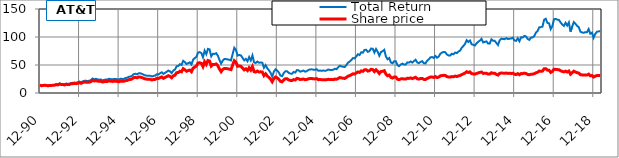
| Category | Total Return | Share price |
|---|---|---|
| 1990-12-31 | 14 | 14 |
| 1991-01-31 | 13.229 | 13.062 |
| 1991-02-28 | 13.609 | 13.438 |
| 1991-03-29 | 14.211 | 14.031 |
| 1991-04-30 | 13.689 | 13.344 |
| 1991-05-31 | 13.273 | 12.938 |
| 1991-06-28 | 13.722 | 13.375 |
| 1991-07-31 | 14.035 | 13.5 |
| 1991-08-30 | 14.295 | 13.75 |
| 1991-09-30 | 14.523 | 13.969 |
| 1991-10-31 | 15.828 | 15.031 |
| 1991-11-29 | 15.203 | 14.438 |
| 1991-12-31 | 17.013 | 16.156 |
| 1992-01-31 | 16.069 | 15.094 |
| 1992-02-28 | 16.069 | 15.094 |
| 1992-03-31 | 15.303 | 14.375 |
| 1992-04-30 | 16.809 | 15.594 |
| 1992-05-29 | 16.236 | 15.062 |
| 1992-06-30 | 16.438 | 15.25 |
| 1992-07-31 | 17.955 | 16.469 |
| 1992-08-31 | 18.126 | 16.625 |
| 1992-09-30 | 18.671 | 17.125 |
| 1992-10-30 | 18.393 | 16.688 |
| 1992-11-30 | 19.116 | 17.344 |
| 1992-12-31 | 20.39 | 18.5 |
| 1993-01-29 | 19.168 | 17.219 |
| 1993-02-26 | 20.734 | 18.625 |
| 1993-03-31 | 21.743 | 19.531 |
| 1993-04-30 | 21.712 | 19.312 |
| 1993-05-31 | 21.571 | 19.188 |
| 1993-06-30 | 21.782 | 19.375 |
| 1993-07-30 | 22.987 | 20.25 |
| 1993-08-31 | 25.824 | 22.75 |
| 1993-09-30 | 24.405 | 21.5 |
| 1993-10-29 | 25.335 | 22.125 |
| 1993-11-30 | 24.333 | 21.25 |
| 1993-12-31 | 23.76 | 20.75 |
| 1994-01-31 | 24.198 | 20.938 |
| 1994-02-28 | 22.609 | 19.562 |
| 1994-03-31 | 23.331 | 20.188 |
| 1994-04-29 | 24.226 | 20.75 |
| 1994-05-31 | 24.007 | 20.562 |
| 1994-06-30 | 25.394 | 21.75 |
| 1994-07-29 | 24.743 | 21 |
| 1994-08-31 | 24.375 | 20.688 |
| 1994-09-30 | 25.038 | 21.25 |
| 1994-10-31 | 24.913 | 20.938 |
| 1994-11-30 | 24.616 | 20.688 |
| 1994-12-30 | 24.021 | 20.188 |
| 1995-01-31 | 25.61 | 21.312 |
| 1995-02-28 | 25.009 | 20.812 |
| 1995-03-31 | 25.235 | 21 |
| 1995-04-28 | 26.77 | 22.062 |
| 1995-05-31 | 27.301 | 22.5 |
| 1995-06-30 | 28.894 | 23.812 |
| 1995-07-31 | 29.453 | 24.062 |
| 1995-08-31 | 30.982 | 25.312 |
| 1995-09-29 | 33.66 | 27.5 |
| 1995-10-31 | 34.455 | 27.938 |
| 1995-11-30 | 33.376 | 27.062 |
| 1995-12-29 | 35.303 | 28.625 |
| 1996-01-31 | 35.166 | 28.312 |
| 1996-02-29 | 34.079 | 27.438 |
| 1996-03-29 | 32.682 | 26.312 |
| 1996-04-30 | 31.409 | 25.062 |
| 1996-05-31 | 30.939 | 24.688 |
| 1996-06-28 | 30.861 | 24.625 |
| 1996-07-31 | 30.902 | 24.438 |
| 1996-08-30 | 29.479 | 23.312 |
| 1996-09-30 | 30.428 | 24.062 |
| 1996-10-31 | 31.015 | 24.312 |
| 1996-11-29 | 33.566 | 26.312 |
| 1996-12-31 | 33.088 | 25.938 |
| 1997-01-31 | 35.377 | 27.5 |
| 1997-02-28 | 36.985 | 28.75 |
| 1997-03-31 | 34.045 | 26.25 |
| 1997-04-30 | 35.991 | 27.75 |
| 1997-05-30 | 37.936 | 29.25 |
| 1997-06-30 | 40.125 | 30.938 |
| 1997-07-31 | 38.66 | 29.594 |
| 1997-08-29 | 35.517 | 27.188 |
| 1997-09-30 | 40.13 | 30.719 |
| 1997-10-31 | 41.853 | 31.812 |
| 1997-11-28 | 47.773 | 36.312 |
| 1997-12-31 | 48.184 | 36.625 |
| 1998-01-30 | 51.458 | 38.875 |
| 1998-02-27 | 50.052 | 37.812 |
| 1998-03-31 | 57.415 | 43.375 |
| 1998-04-30 | 55.148 | 41.438 |
| 1998-05-29 | 51.738 | 38.875 |
| 1998-06-30 | 53.235 | 40 |
| 1998-07-31 | 54.805 | 40.938 |
| 1998-08-31 | 50.956 | 38.062 |
| 1998-09-30 | 59.407 | 44.375 |
| 1998-10-30 | 62.303 | 46.312 |
| 1998-11-30 | 64.489 | 47.938 |
| 1998-12-31 | 72.141 | 53.625 |
| 1999-01-29 | 72.959 | 54 |
| 1999-02-26 | 71.439 | 52.875 |
| 1999-03-31 | 63.755 | 47.188 |
| 1999-04-30 | 75.676 | 55.75 |
| 1999-05-31 | 69.398 | 51.125 |
| 1999-06-30 | 78.73 | 58 |
| 1999-07-30 | 77.875 | 57.125 |
| 1999-08-31 | 65.521 | 48.062 |
| 1999-09-30 | 69.963 | 51.062 |
| 1999-10-29 | 69.706 | 50.875 |
| 1999-11-30 | 71.076 | 51.875 |
| 1999-12-31 | 66.794 | 48.75 |
| 2000-01-31 | 59.072 | 42.875 |
| 2000-02-29 | 52.441 | 38.062 |
| 2000-03-31 | 58.038 | 42.125 |
| 2000-04-28 | 60.687 | 43.812 |
| 2000-05-31 | 60.515 | 43.688 |
| 2000-06-30 | 59.908 | 43.25 |
| 2000-07-31 | 59.3 | 42.562 |
| 2000-08-31 | 58.168 | 41.75 |
| 2000-09-29 | 69.662 | 50 |
| 2000-10-31 | 80.754 | 57.688 |
| 2000-11-30 | 76.904 | 54.938 |
| 2000-12-29 | 66.843 | 47.75 |
| 2001-01-31 | 68.025 | 48.35 |
| 2001-02-28 | 67.111 | 47.7 |
| 2001-03-30 | 62.791 | 44.63 |
| 2001-04-30 | 58.38 | 41.25 |
| 2001-05-31 | 60.927 | 43.05 |
| 2001-06-29 | 56.695 | 40.06 |
| 2001-07-31 | 64.138 | 45.03 |
| 2001-08-31 | 58.269 | 40.91 |
| 2001-09-28 | 67.114 | 47.12 |
| 2001-10-31 | 54.591 | 38.11 |
| 2001-11-30 | 53.545 | 37.38 |
| 2001-12-31 | 56.109 | 39.17 |
| 2002-01-31 | 53.991 | 37.45 |
| 2002-02-28 | 54.554 | 37.84 |
| 2002-03-29 | 53.977 | 37.44 |
| 2002-04-30 | 45.11 | 31.06 |
| 2002-05-31 | 49.801 | 34.29 |
| 2002-06-28 | 44.297 | 30.5 |
| 2002-07-31 | 40.515 | 27.66 |
| 2002-08-30 | 36.238 | 24.74 |
| 2002-09-30 | 29.441 | 20.1 |
| 2002-10-31 | 38.081 | 25.66 |
| 2002-11-29 | 42.296 | 28.5 |
| 2002-12-31 | 40.233 | 27.11 |
| 2003-01-31 | 36.611 | 24.44 |
| 2003-02-28 | 31.158 | 20.8 |
| 2003-03-31 | 30.05 | 20.06 |
| 2003-04-30 | 35.535 | 23.36 |
| 2003-05-30 | 38.729 | 25.46 |
| 2003-06-30 | 38.866 | 25.55 |
| 2003-07-31 | 36.055 | 23.36 |
| 2003-08-29 | 34.666 | 22.46 |
| 2003-09-30 | 34.342 | 22.25 |
| 2003-10-31 | 37.651 | 23.98 |
| 2003-11-28 | 36.552 | 23.28 |
| 2003-12-31 | 40.933 | 26.07 |
| 2004-01-30 | 40.499 | 25.5 |
| 2004-02-27 | 38.133 | 24.01 |
| 2004-03-31 | 38.975 | 24.54 |
| 2004-04-30 | 40.04 | 24.9 |
| 2004-05-31 | 38.11 | 23.7 |
| 2004-06-30 | 38.995 | 24.25 |
| 2004-07-30 | 41.281 | 25.34 |
| 2004-08-31 | 42.014 | 25.79 |
| 2004-09-30 | 42.275 | 25.95 |
| 2004-10-29 | 41.624 | 25.26 |
| 2004-11-30 | 41.476 | 25.17 |
| 2004-12-31 | 42.465 | 25.77 |
| 2005-01-31 | 39.655 | 23.76 |
| 2005-02-28 | 40.155 | 24.06 |
| 2005-03-31 | 39.538 | 23.69 |
| 2005-04-29 | 40.257 | 23.8 |
| 2005-05-31 | 39.547 | 23.38 |
| 2005-06-30 | 40.173 | 23.75 |
| 2005-07-29 | 41.922 | 24.45 |
| 2005-08-31 | 41.287 | 24.08 |
| 2005-09-30 | 41.099 | 23.97 |
| 2005-10-31 | 41.459 | 23.85 |
| 2005-11-30 | 43.301 | 24.91 |
| 2005-12-30 | 42.571 | 24.49 |
| 2006-01-31 | 45.711 | 25.95 |
| 2006-02-28 | 48.599 | 27.59 |
| 2006-03-31 | 47.63 | 27.04 |
| 2006-04-28 | 46.749 | 26.21 |
| 2006-05-31 | 46.481 | 26.06 |
| 2006-06-30 | 49.746 | 27.89 |
| 2006-07-31 | 54.134 | 29.99 |
| 2006-08-31 | 56.192 | 31.13 |
| 2006-09-29 | 58.773 | 32.56 |
| 2006-10-31 | 62.471 | 34.25 |
| 2006-11-30 | 61.85 | 33.91 |
| 2006-12-29 | 65.206 | 35.75 |
| 2007-01-31 | 69.356 | 37.63 |
| 2007-02-28 | 67.826 | 36.8 |
| 2007-03-30 | 72.674 | 39.43 |
| 2007-04-30 | 72.01 | 38.72 |
| 2007-05-31 | 76.883 | 41.34 |
| 2007-06-29 | 77.18 | 41.5 |
| 2007-07-31 | 73.465 | 39.16 |
| 2007-08-31 | 74.797 | 39.87 |
| 2007-09-28 | 79.374 | 42.31 |
| 2007-10-31 | 79.059 | 41.79 |
| 2007-11-30 | 72.286 | 38.21 |
| 2007-12-31 | 78.624 | 41.56 |
| 2008-01-31 | 73.559 | 38.49 |
| 2008-02-29 | 66.565 | 34.83 |
| 2008-03-31 | 73.196 | 38.3 |
| 2008-04-30 | 74.743 | 38.71 |
| 2008-05-30 | 77.04 | 39.9 |
| 2008-06-30 | 65.05 | 33.69 |
| 2008-07-31 | 60.211 | 30.81 |
| 2008-08-29 | 62.517 | 31.99 |
| 2008-09-30 | 54.563 | 27.92 |
| 2008-10-31 | 53.162 | 26.77 |
| 2008-11-28 | 56.717 | 28.56 |
| 2008-12-31 | 56.598 | 28.5 |
| 2009-01-30 | 49.629 | 24.62 |
| 2009-02-27 | 47.916 | 23.77 |
| 2009-03-31 | 50.798 | 25.2 |
| 2009-04-30 | 52.474 | 25.62 |
| 2009-05-29 | 50.774 | 24.79 |
| 2009-06-30 | 50.877 | 24.84 |
| 2009-07-31 | 54.659 | 26.23 |
| 2009-08-31 | 54.284 | 26.05 |
| 2009-09-30 | 56.285 | 27.01 |
| 2009-10-30 | 54.33 | 25.67 |
| 2009-11-30 | 57.018 | 26.94 |
| 2009-12-31 | 59.325 | 28.03 |
| 2010-01-29 | 54.491 | 25.36 |
| 2010-02-26 | 53.309 | 24.81 |
| 2010-03-31 | 55.522 | 25.84 |
| 2010-04-30 | 56.911 | 26.06 |
| 2010-05-31 | 53.068 | 24.3 |
| 2010-06-30 | 52.828 | 24.19 |
| 2010-07-30 | 57.627 | 25.94 |
| 2010-08-31 | 60.049 | 27.03 |
| 2010-09-30 | 63.537 | 28.6 |
| 2010-10-29 | 64.289 | 28.52 |
| 2010-11-30 | 62.643 | 27.79 |
| 2010-12-31 | 66.227 | 29.38 |
| 2011-01-31 | 62.95 | 27.52 |
| 2011-02-28 | 64.917 | 28.38 |
| 2011-03-31 | 70.018 | 30.61 |
| 2011-04-29 | 72.189 | 31.12 |
| 2011-05-31 | 73.21 | 31.56 |
| 2011-06-30 | 72.862 | 31.41 |
| 2011-07-29 | 68.809 | 29.26 |
| 2011-08-31 | 66.974 | 28.48 |
| 2011-09-30 | 67.069 | 28.52 |
| 2011-10-31 | 69.973 | 29.31 |
| 2011-11-30 | 69.185 | 28.98 |
| 2011-12-30 | 72.194 | 30.24 |
| 2012-01-31 | 71.253 | 29.41 |
| 2012-02-29 | 74.112 | 30.59 |
| 2012-03-30 | 75.662 | 31.23 |
| 2012-04-30 | 80.866 | 32.91 |
| 2012-05-31 | 83.963 | 34.17 |
| 2012-06-29 | 87.624 | 35.66 |
| 2012-07-31 | 94.334 | 37.92 |
| 2012-08-31 | 91.15 | 36.64 |
| 2012-09-28 | 93.787 | 37.7 |
| 2012-10-31 | 87.05 | 34.59 |
| 2012-11-30 | 85.892 | 34.13 |
| 2012-12-31 | 84.835 | 33.71 |
| 2013-01-31 | 88.7 | 34.79 |
| 2013-02-28 | 91.556 | 35.91 |
| 2013-03-29 | 93.544 | 36.69 |
| 2013-04-30 | 96.65 | 37.46 |
| 2013-05-31 | 90.277 | 34.99 |
| 2013-06-28 | 91.335 | 35.4 |
| 2013-07-31 | 92.15 | 35.27 |
| 2013-08-30 | 88.388 | 33.83 |
| 2013-09-30 | 88.362 | 33.82 |
| 2013-10-31 | 95.866 | 36.2 |
| 2013-11-30 | 93.244 | 35.21 |
| 2013-12-31 | 93.112 | 35.16 |
| 2014-01-31 | 89.424 | 33.32 |
| 2014-02-28 | 85.694 | 31.93 |
| 2014-03-31 | 94.121 | 35.07 |
| 2014-04-30 | 97.062 | 35.7 |
| 2014-05-31 | 96.436 | 35.47 |
| 2014-06-30 | 96.137 | 35.36 |
| 2014-07-31 | 98.014 | 35.59 |
| 2014-08-31 | 96.279 | 34.96 |
| 2014-09-30 | 97.05 | 35.24 |
| 2014-10-31 | 97.204 | 34.84 |
| 2014-11-30 | 98.711 | 35.38 |
| 2014-12-31 | 93.717 | 33.59 |
| 2015-01-30 | 93.149 | 32.92 |
| 2015-02-27 | 97.789 | 34.56 |
| 2015-03-31 | 92.385 | 32.65 |
| 2015-04-30 | 99.427 | 34.64 |
| 2015-05-29 | 99.14 | 34.54 |
| 2015-06-30 | 101.952 | 35.52 |
| 2015-07-31 | 101.061 | 34.74 |
| 2015-08-31 | 96.581 | 33.2 |
| 2015-09-30 | 94.777 | 32.58 |
| 2015-10-30 | 98.866 | 33.51 |
| 2015-11-30 | 99.338 | 33.67 |
| 2015-12-31 | 101.521 | 34.41 |
| 2016-01-29 | 107.889 | 36.06 |
| 2016-02-29 | 110.551 | 36.95 |
| 2016-03-31 | 117.193 | 39.17 |
| 2016-04-29 | 117.589 | 38.82 |
| 2016-05-31 | 118.589 | 39.15 |
| 2016-06-30 | 130.887 | 43.21 |
| 2016-07-29 | 132.59 | 43.29 |
| 2016-08-31 | 125.208 | 40.88 |
| 2016-09-30 | 124.381 | 40.61 |
| 2016-10-31 | 114.062 | 36.79 |
| 2016-11-30 | 119.767 | 38.63 |
| 2016-12-30 | 131.859 | 42.53 |
| 2017-01-31 | 132.261 | 42.16 |
| 2017-02-28 | 131.1 | 41.79 |
| 2017-03-31 | 130.348 | 41.55 |
| 2017-04-28 | 125.825 | 39.63 |
| 2017-05-31 | 122.332 | 38.53 |
| 2017-06-30 | 119.793 | 37.73 |
| 2017-07-31 | 125.457 | 39 |
| 2017-08-31 | 120.503 | 37.46 |
| 2017-09-29 | 126.003 | 39.17 |
| 2017-10-31 | 109.621 | 33.65 |
| 2017-11-30 | 118.514 | 36.38 |
| 2017-12-29 | 126.659 | 38.88 |
| 2018-01-31 | 123.627 | 37.45 |
| 2018-02-28 | 119.831 | 36.3 |
| 2018-03-30 | 117.685 | 35.65 |
| 2018-04-30 | 109.481 | 32.7 |
| 2018-05-31 | 108.209 | 32.32 |
| 2018-06-29 | 107.506 | 32.11 |
| 2018-07-31 | 108.702 | 31.97 |
| 2018-08-31 | 108.6 | 31.94 |
| 2018-09-28 | 114.176 | 33.58 |
| 2018-10-31 | 105.873 | 30.68 |
| 2018-11-30 | 107.805 | 31.24 |
| 2018-12-31 | 98.488 | 28.54 |
| 2019-01-31 | 105.491 | 30.06 |
| 2019-02-28 | 109.211 | 31.12 |
| 2019-03-29 | 110.053 | 31.36 |
| 2019-04-30 | 110.395 | 30.96 |